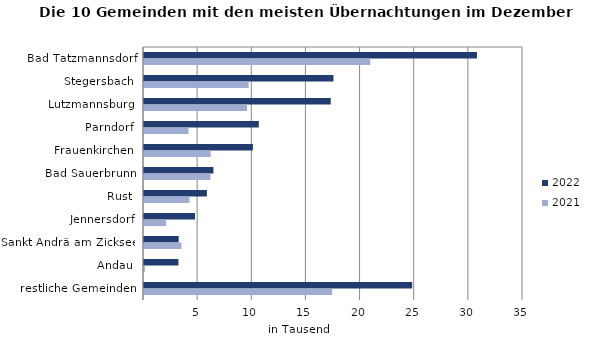
| Category | 2022 | 2021 |
|---|---|---|
| Bad Tatzmannsdorf | 30749 | 20895 |
| Stegersbach | 17498 | 9662 |
| Lutzmannsburg | 17246 | 9517 |
| Parndorf | 10603 | 4113 |
| Frauenkirchen | 10058 | 6161 |
| Bad Sauerbrunn | 6413 | 6135 |
| Rust | 5811 | 4205 |
| Jennersdorf | 4710 | 2048 |
| Sankt Andrä am Zicksee | 3205 | 3462 |
| Andau | 3178 | 80 |
| restliche Gemeinden | 24765 | 17383 |